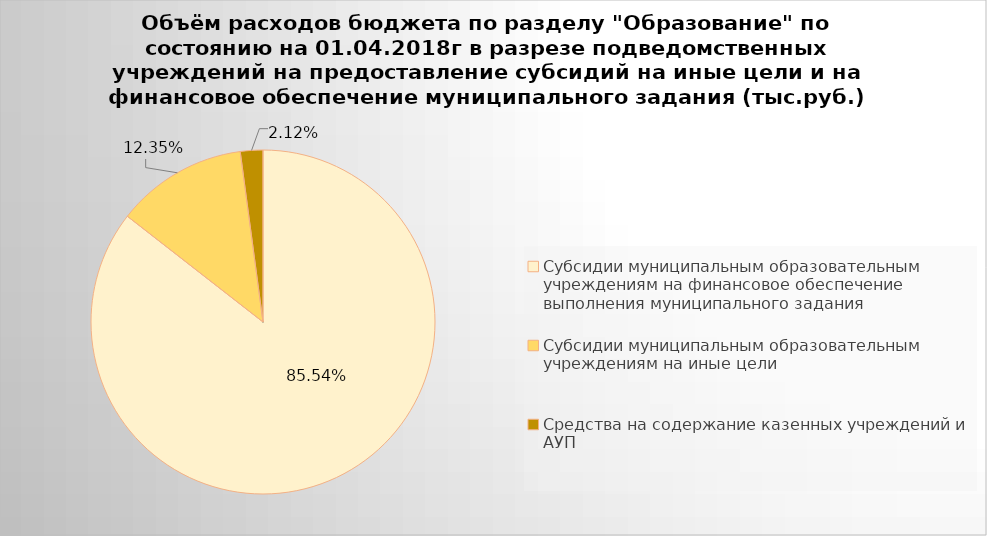
| Category | Series 0 |
|---|---|
| Субсидии муниципальным образовательным учреждениям на финансовое обеспечение выполнения муниципального задания | 4189327.13 |
| Субсидии муниципальным образовательным учреждениям на иные цели | 604693.7 |
| Средства на содержание казенных учреждений и АУП | 103622.71 |